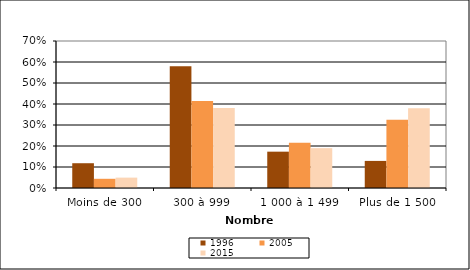
| Category | 1996 | 2005 | 2015 |
|---|---|---|---|
| Moins de 300 | 0.118 | 0.044 | 0.049 |
| 300 à 999 | 0.58 | 0.415 | 0.381 |
| 1 000 à 1 499 | 0.173 | 0.216 | 0.19 |
| Plus de 1 500 | 0.129 | 0.325 | 0.379 |